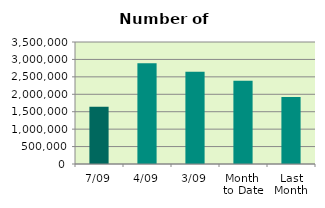
| Category | Series 0 |
|---|---|
| 7/09 | 1639110 |
| 4/09 | 2889244 |
| 3/09 | 2648350 |
| Month 
to Date | 2389333.2 |
| Last
Month | 1925290.095 |